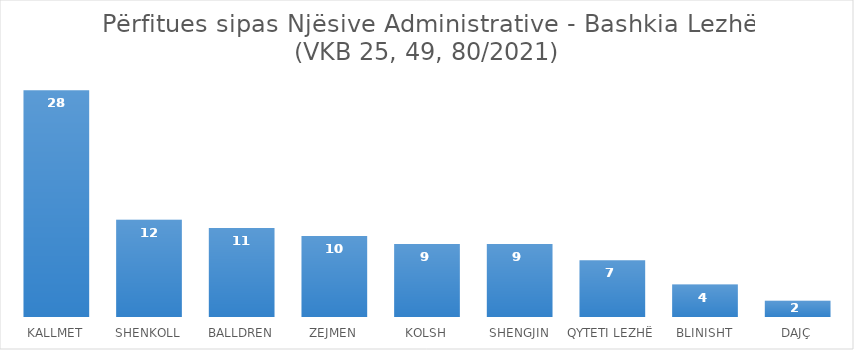
| Category | Subjekte Përfitues |
|---|---|
| KALLMET | 28 |
| SHENKOLL | 12 |
| BALLDREN | 11 |
| ZEJMEN | 10 |
| KOLSH | 9 |
| SHENGJIN | 9 |
| QYTETI LEZHË | 7 |
| BLINISHT | 4 |
| DAJÇ | 2 |